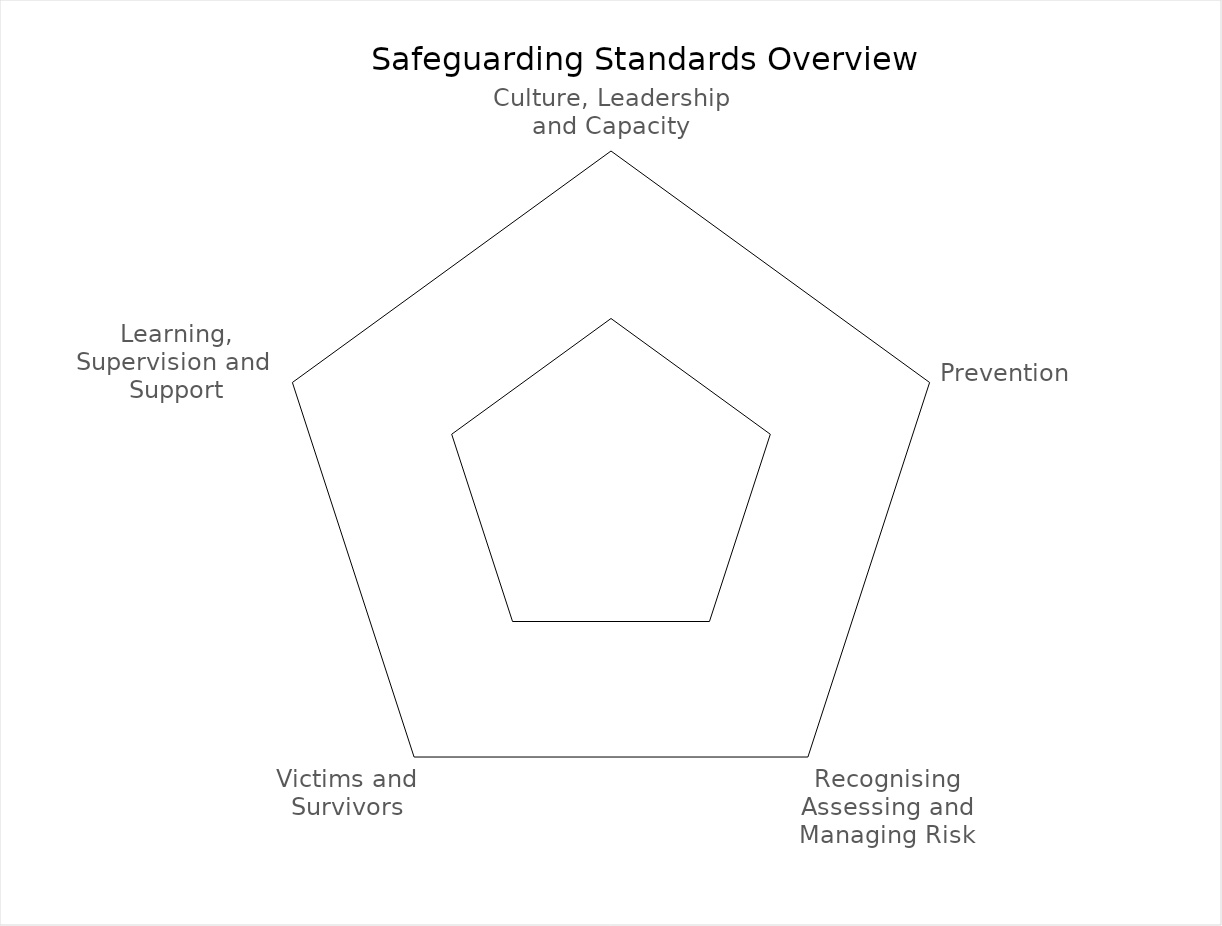
| Category | Series 0 |
|---|---|
| Culture, Leadership and Capacity | 0 |
| Prevention | 0 |
| Recognising Assessing and Managing Risk | 0 |
| Victims and Survivors | 0 |
| Learning, Supervision and  Support | 0 |